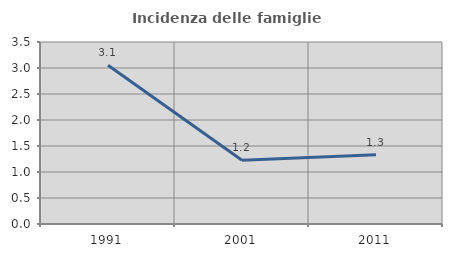
| Category | Incidenza delle famiglie numerose |
|---|---|
| 1991.0 | 3.055 |
| 2001.0 | 1.226 |
| 2011.0 | 1.333 |